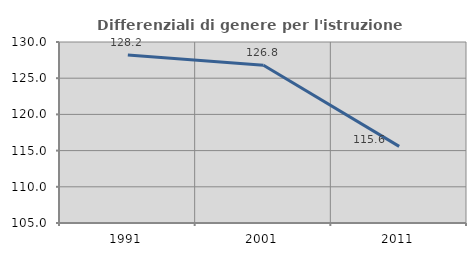
| Category | Differenziali di genere per l'istruzione superiore |
|---|---|
| 1991.0 | 128.199 |
| 2001.0 | 126.787 |
| 2011.0 | 115.581 |